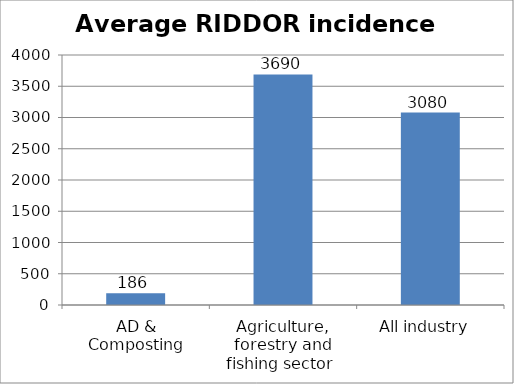
| Category | Series 0 |
|---|---|
| AD & Composting | 186.093 |
| Agriculture, forestry and fishing sector  | 3690 |
| All industry  | 3080 |